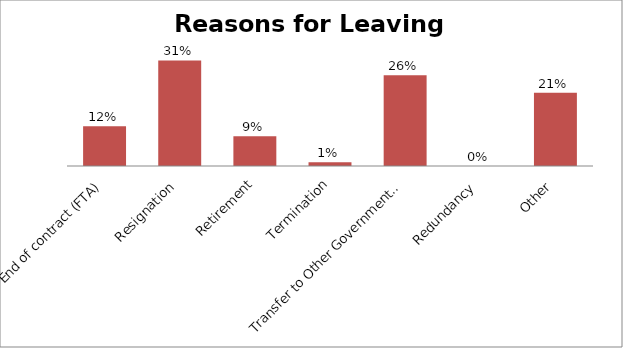
| Category | Leaving Reason |
|---|---|
| End of contract (FTA) | 0.116 |
| Resignation | 0.308 |
| Retirement | 0.087 |
| Termination | 0.011 |
| Transfer to Other Government Department  | 0.264 |
| Redundancy | 0 |
| Other | 0.214 |